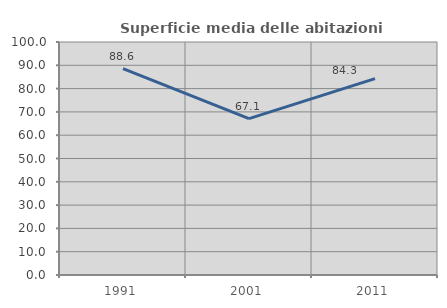
| Category | Superficie media delle abitazioni occupate |
|---|---|
| 1991.0 | 88.59 |
| 2001.0 | 67.141 |
| 2011.0 | 84.282 |